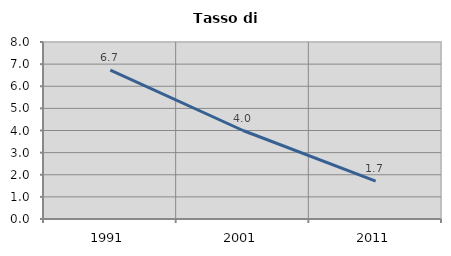
| Category | Tasso di disoccupazione   |
|---|---|
| 1991.0 | 6.731 |
| 2001.0 | 4 |
| 2011.0 | 1.709 |